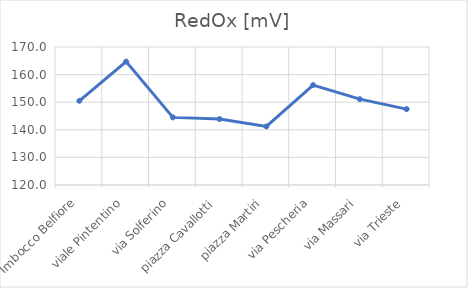
| Category | RedOx [mV] |
|---|---|
| Imbocco Belfiore | 150.5 |
| viale Pintentino | 164.7 |
| via Solferino | 144.5 |
| piazza Cavallotti | 143.9 |
| piazza Martiri | 141.2 |
| via Pescheria | 156.2 |
| via Massari | 151.1 |
| via Trieste | 147.5 |